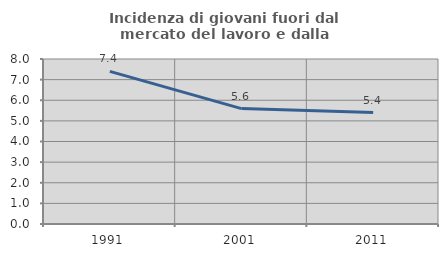
| Category | Incidenza di giovani fuori dal mercato del lavoro e dalla formazione  |
|---|---|
| 1991.0 | 7.403 |
| 2001.0 | 5.595 |
| 2011.0 | 5.401 |